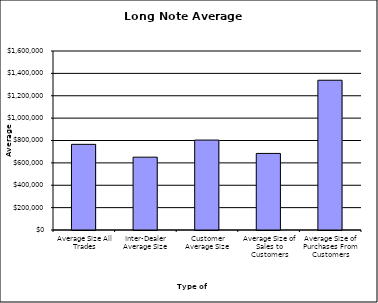
| Category | Security Type |
|---|---|
| Average Size All Trades | 765579.241 |
| Inter-Dealer Average Size | 651047.483 |
| Customer Average Size | 803819.625 |
| Average Size of Sales to Customers | 684421.922 |
| Average Size of Purchases From Customers | 1338650.521 |